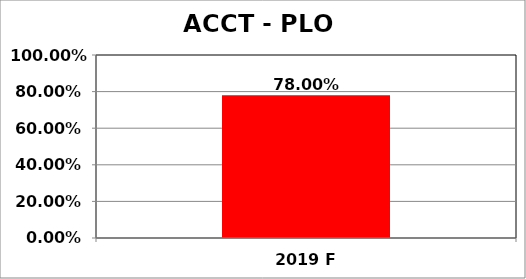
| Category | Series 0 |
|---|---|
| 2019 F | 0.78 |